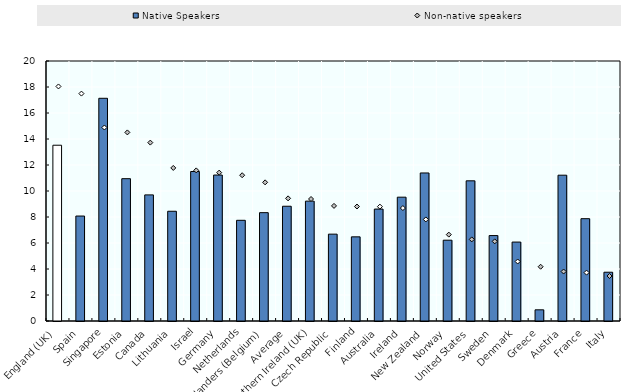
| Category | Native Speakers |
|---|---|
| England (UK) | 13.522 |
| Spain | 8.074 |
| Singapore | 17.131 |
| Estonia | 10.948 |
| Canada | 9.702 |
| Lithuania | 8.442 |
| Israel | 11.499 |
| Germany | 11.228 |
| Netherlands | 7.746 |
| Flanders (Belgium) | 8.335 |
| Average | 8.828 |
| Northern Ireland (UK) | 9.221 |
| Czech Republic | 6.681 |
| Finland | 6.473 |
| Australia | 8.61 |
| Ireland | 9.525 |
| New Zealand | 11.387 |
| Norway | 6.216 |
| United States | 10.783 |
| Sweden | 6.572 |
| Denmark | 6.072 |
| Greece | 0.86 |
| Austria | 11.215 |
| France | 7.871 |
| Italy | 3.752 |